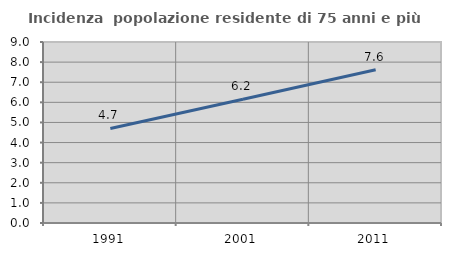
| Category | Incidenza  popolazione residente di 75 anni e più |
|---|---|
| 1991.0 | 4.7 |
| 2001.0 | 6.152 |
| 2011.0 | 7.623 |